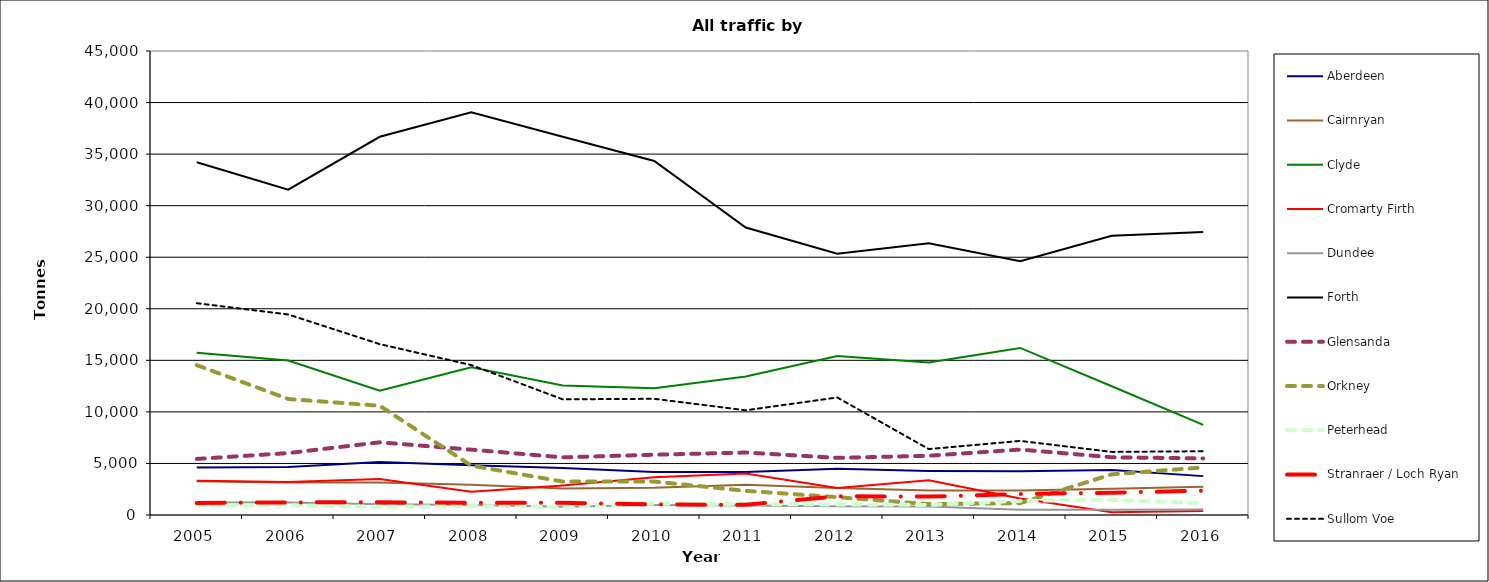
| Category | Aberdeen | Cairnryan | Clyde | Cromarty Firth | Dundee | Forth | Glensanda | Orkney | Peterhead | Stranraer / Loch Ryan | Sullom Voe |
|---|---|---|---|---|---|---|---|---|---|---|---|
| 2005.0 | 4609 | 3274 | 15737 | 3325 | 1222 | 34218 | 5439 | 14534 | 928 | 1165 | 20541 |
| 2006.0 | 4663 | 3145 | 14981 | 3206 | 1202 | 31556 | 6004 | 11249 | 947 | 1222 | 19447 |
| 2007.0 | 5131 | 3163 | 12063 | 3502 | 1035 | 36681 | 7050 | 10592 | 790 | 1231 | 16573 |
| 2008.0 | 4833 | 2928 | 14338 | 2252 | 978 | 39054 | 6336 | 4789 | 871 | 1190 | 14539 |
| 2009.0 | 4570 | 2572 | 12552 | 2864 | 810 | 36690 | 5591 | 3241 | 797 | 1177 | 11217 |
| 2010.0 | 4164 | 2634 | 12283 | 3663 | 962 | 34335 | 5846 | 3244 | 1107 | 1017 | 11270 |
| 2011.0 | 4165 | 2932 | 13431 | 4020 | 929 | 27878 | 6060 | 2344 | 1054 | 986 | 10153 |
| 2012.0 | 4493 | 2610 | 15421 | 2628 | 842 | 25332 | 5541 | 1729 | 1024 | 1815 | 11398 |
| 2013.0 | 4264 | 2365 | 14783 | 3378 | 815 | 26365 | 5746 | 1054 | 971 | 1783 | 6394 |
| 2014.0 | 4231 | 2368 | 16201 | 1591 | 517 | 24608 | 6347 | 1151 | 1377 | 2038 | 7185 |
| 2015.0 | 4375.979 | 2548.415 | 12484.055 | 261.784 | 514.908 | 27074.039 | 5597.361 | 3945.42 | 1467.652 | 2163.254 | 6119.589 |
| 2016.0 | 3770 | 2740 | 8742 | 395 | 534 | 27439 | 5487 | 4615 | 1148 | 2356 | 6183 |